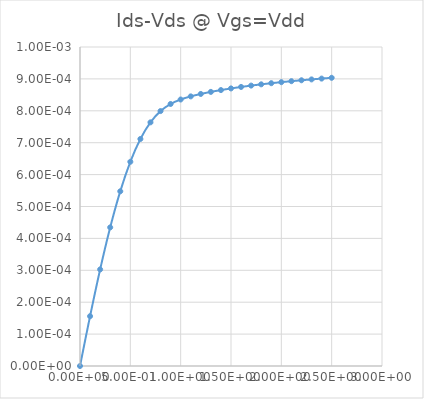
| Category | Series 0 |
|---|---|
| 0.0 | 0 |
| 0.1 | 0 |
| 0.2 | 0 |
| 0.3 | 0 |
| 0.4 | 0.001 |
| 0.5 | 0.001 |
| 0.6 | 0.001 |
| 0.7 | 0.001 |
| 0.8 | 0.001 |
| 0.9 | 0.001 |
| 1.0 | 0.001 |
| 1.1 | 0.001 |
| 1.2 | 0.001 |
| 1.3 | 0.001 |
| 1.4 | 0.001 |
| 1.5 | 0.001 |
| 1.6 | 0.001 |
| 1.7 | 0.001 |
| 1.8 | 0.001 |
| 1.9 | 0.001 |
| 2.0 | 0.001 |
| 2.1 | 0.001 |
| 2.2 | 0.001 |
| 2.3 | 0.001 |
| 2.4 | 0.001 |
| 2.5 | 0.001 |